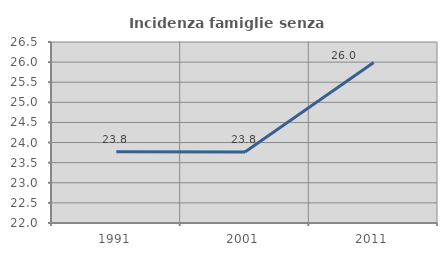
| Category | Incidenza famiglie senza nuclei |
|---|---|
| 1991.0 | 23.769 |
| 2001.0 | 23.767 |
| 2011.0 | 25.992 |